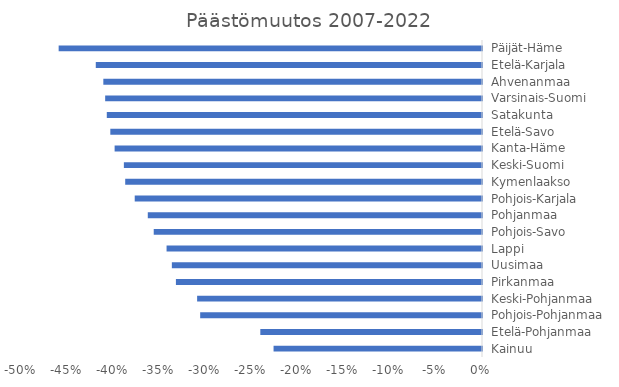
| Category | Päästömuutos 2007-2022 |
|---|---|
| Kainuu | -0.227 |
| Etelä-Pohjanmaa | -0.241 |
| Pohjois-Pohjanmaa | -0.306 |
| Keski-Pohjanmaa | -0.31 |
| Pirkanmaa | -0.333 |
| Uusimaa | -0.337 |
| Lappi | -0.343 |
| Pohjois-Savo | -0.357 |
| Pohjanmaa | -0.363 |
| Pohjois-Karjala | -0.377 |
| Kymenlaakso | -0.388 |
| Keski-Suomi | -0.389 |
| Kanta-Häme | -0.399 |
| Etelä-Savo | -0.404 |
| Satakunta | -0.408 |
| Varsinais-Suomi | -0.41 |
| Ahvenanmaa | -0.412 |
| Etelä-Karjala | -0.42 |
| Päijät-Häme | -0.46 |